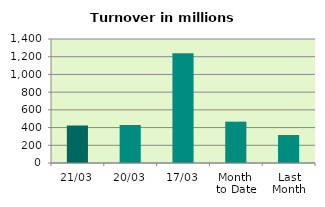
| Category | Series 0 |
|---|---|
| 21/03 | 423.392 |
| 20/03 | 428.773 |
| 17/03 | 1239.158 |
| Month 
to Date | 466.874 |
| Last
Month | 316.082 |